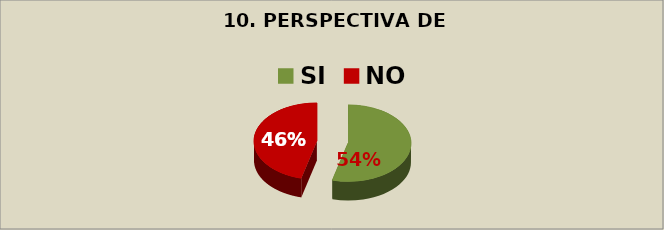
| Category | Series 0 |
|---|---|
| SI | 0.54 |
| NO | 0.46 |